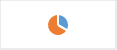
| Category | Section 1.A : Pilotage et définition des objectifs de la LAV |
|---|---|
| 0 | 0.333 |
| 1 | 0.667 |